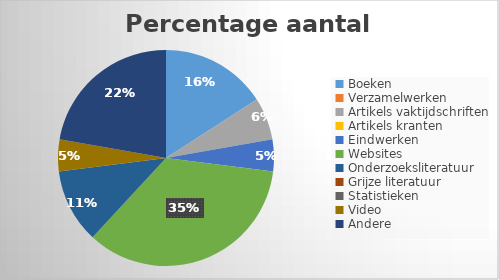
| Category | Series 0 |
|---|---|
| Boeken | 0.159 |
| Verzamelwerken | 0 |
| Artikels vaktijdschriften | 0.063 |
| Artikels kranten | 0 |
| Eindwerken | 0.048 |
| Websites | 0.349 |
| Onderzoeksliteratuur | 0.111 |
| Grijze literatuur | 0 |
| Statistieken | 0 |
| Video | 0.048 |
| Andere | 0.222 |